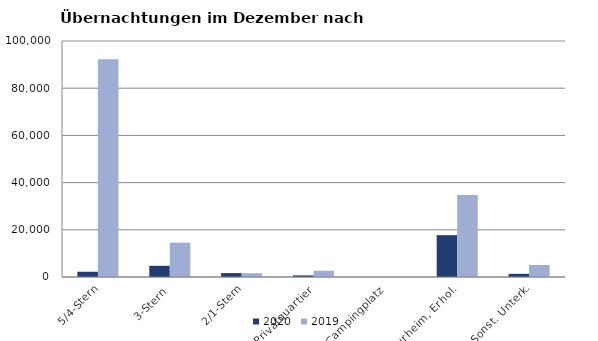
| Category | 2020 | 2019 |
|---|---|---|
| 5/4-Stern | 2220 | 92282 |
| 3-Stern | 4747 | 14545 |
| 2/1-Stern | 1647 | 1617 |
| Privatquartier | 673 | 2662 |
| Campingplatz | 0 | 49 |
| Kurheim, Erhol. | 17726 | 34786 |
| Sonst. Unterk. | 1340 | 5090 |